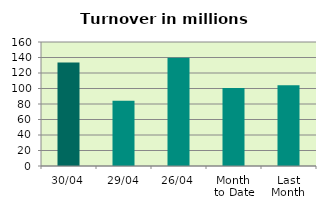
| Category | Series 0 |
|---|---|
| 30/04 | 133.503 |
| 29/04 | 84.049 |
| 26/04 | 139.625 |
| Month 
to Date | 100.792 |
| Last
Month | 104.085 |